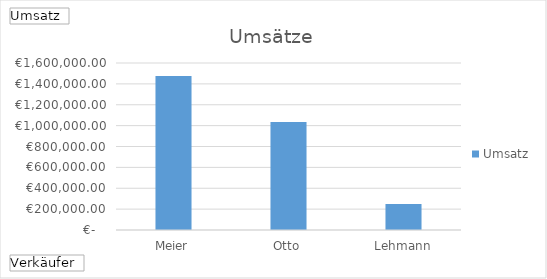
| Category | Ergebnis |
|---|---|
| Meier | 1476398.232 |
| Otto | 1033622.091 |
| Lehmann | 249334.868 |